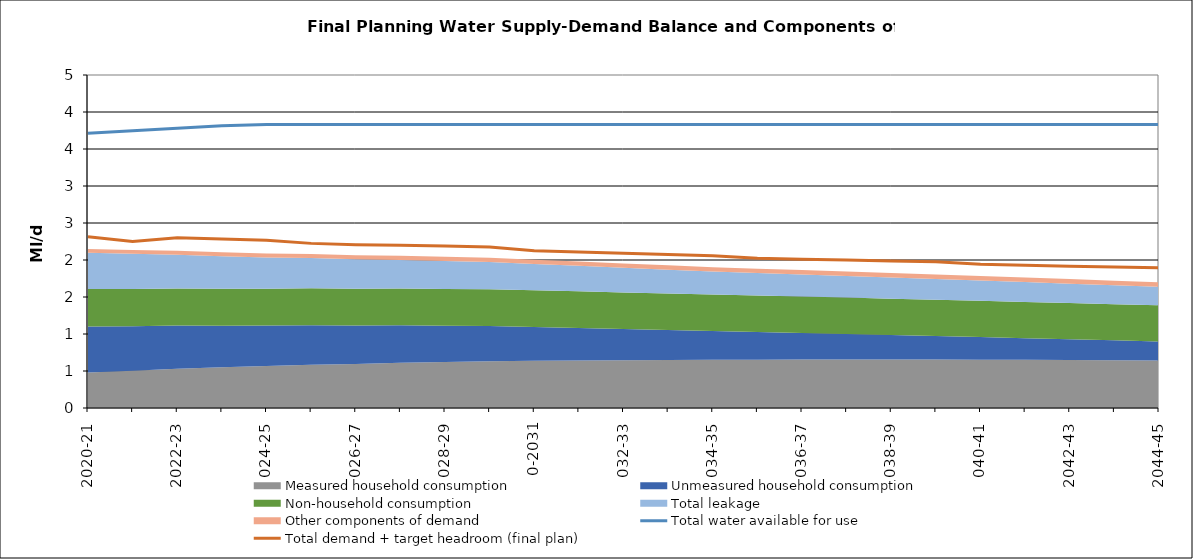
| Category | Total water available for use | Total demand + target headroom (final plan) |
|---|---|---|
| 0 | 3.714 | 2.315 |
| 1 | 3.746 | 2.251 |
| 2 | 3.779 | 2.299 |
| 3 | 3.813 | 2.284 |
| 4 | 3.83 | 2.268 |
| 5 | 3.83 | 2.225 |
| 6 | 3.83 | 2.207 |
| 7 | 3.83 | 2.201 |
| 8 | 3.83 | 2.188 |
| 9 | 3.83 | 2.174 |
| 10 | 3.83 | 2.125 |
| 11 | 3.83 | 2.106 |
| 12 | 3.83 | 2.09 |
| 13 | 3.83 | 2.074 |
| 14 | 3.83 | 2.057 |
| 15 | 3.83 | 2.022 |
| 16 | 3.83 | 2.01 |
| 17 | 3.83 | 1.999 |
| 18 | 3.83 | 1.986 |
| 19 | 3.83 | 1.976 |
| 20 | 3.83 | 1.941 |
| 21 | 3.83 | 1.93 |
| 22 | 3.83 | 1.916 |
| 23 | 3.83 | 1.906 |
| 24 | 3.83 | 1.894 |